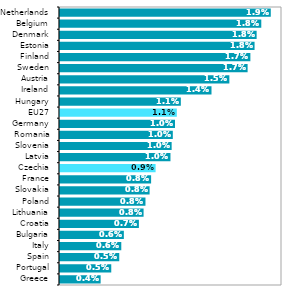
| Category | 2019* |
|---|---|
| Greece | 0.004 |
| Portugal | 0.005 |
| Spain | 0.005 |
| Italy | 0.006 |
| Bulgaria | 0.006 |
| Croatia | 0.007 |
| Lithuania | 0.008 |
| Poland | 0.008 |
| Slovakia | 0.008 |
| France | 0.008 |
| Czechia | 0.009 |
| Latvia | 0.01 |
| Slovenia | 0.01 |
| Romania | 0.01 |
| Germany | 0.01 |
| EU27 | 0.011 |
| Hungary | 0.011 |
| Ireland | 0.014 |
| Austria | 0.015 |
| Sweden | 0.017 |
| Finland | 0.017 |
| Estonia | 0.018 |
| Denmark | 0.018 |
| Belgium | 0.018 |
| Netherlands | 0.019 |